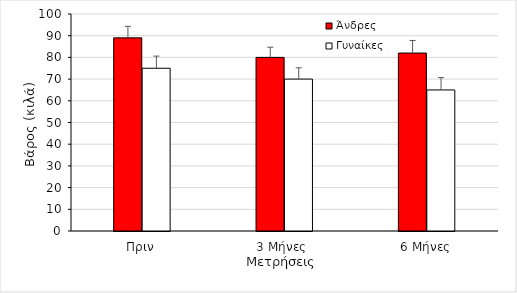
| Category | Άνδρες | Γυναίκες |
|---|---|---|
| Πριν | 89 | 75 |
| 3 Μήνες  | 80 | 70 |
| 6 Μήνες | 82 | 65 |